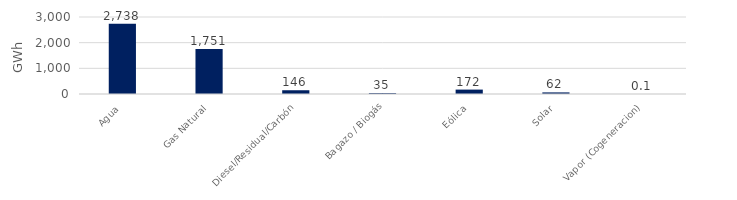
| Category | Series 0 |
|---|---|
| Agua | 2738.25 |
| Gas Natural | 1751.384 |
| Diesel/Residual/Carbón | 146.406 |
| Bagazo / Biogás | 35.155 |
| Eólica | 171.865 |
| Solar | 62.219 |
| Vapor (Cogeneracion) | 0.131 |